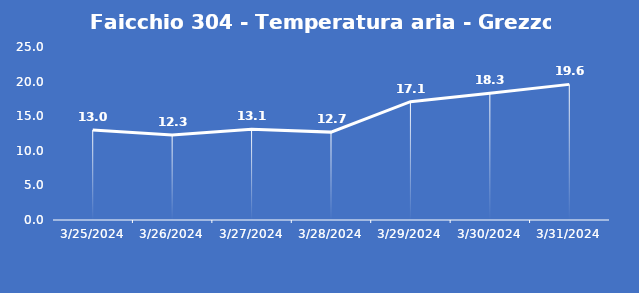
| Category | Faicchio 304 - Temperatura aria - Grezzo (°C) |
|---|---|
| 3/25/24 | 13 |
| 3/26/24 | 12.3 |
| 3/27/24 | 13.1 |
| 3/28/24 | 12.7 |
| 3/29/24 | 17.1 |
| 3/30/24 | 18.3 |
| 3/31/24 | 19.6 |